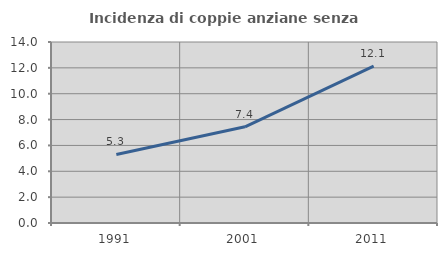
| Category | Incidenza di coppie anziane senza figli  |
|---|---|
| 1991.0 | 5.304 |
| 2001.0 | 7.442 |
| 2011.0 | 12.138 |